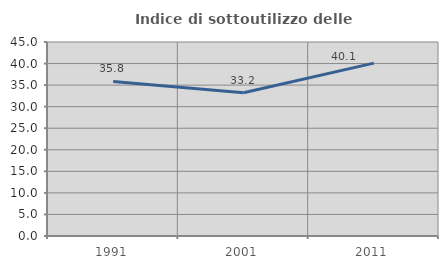
| Category | Indice di sottoutilizzo delle abitazioni  |
|---|---|
| 1991.0 | 35.849 |
| 2001.0 | 33.212 |
| 2011.0 | 40.097 |